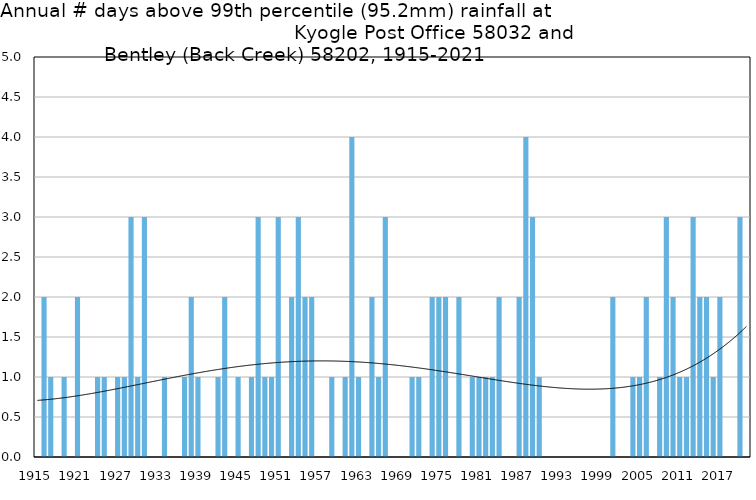
| Category | Annual # days above 99th percentile |
|---|---|
| 1915 | 0 |
| 1916 | 2 |
| 1917 | 1 |
| 1918 | 0 |
| 1919 | 1 |
| 1920 | 0 |
| 1921 | 2 |
| 1922 | 0 |
| 1923 | 0 |
| 1924 | 1 |
| 1925 | 1 |
| 1926 | 0 |
| 1927 | 1 |
| 1928 | 1 |
| 1929 | 3 |
| 1930 | 1 |
| 1931 | 3 |
| 1932 | 0 |
| 1933 | 0 |
| 1934 | 1 |
| 1935 | 0 |
| 1936 | 0 |
| 1937 | 1 |
| 1938 | 2 |
| 1939 | 1 |
| 1940 | 0 |
| 1941 | 0 |
| 1942 | 1 |
| 1943 | 2 |
| 1944 | 0 |
| 1945 | 1 |
| 1946 | 0 |
| 1947 | 1 |
| 1948 | 3 |
| 1949 | 1 |
| 1950 | 1 |
| 1951 | 3 |
| 1952 | 0 |
| 1953 | 2 |
| 1954 | 3 |
| 1955 | 2 |
| 1956 | 2 |
| 1957 | 0 |
| 1958 | 0 |
| 1959 | 1 |
| 1960 | 0 |
| 1961 | 1 |
| 1962 | 4 |
| 1963 | 1 |
| 1964 | 0 |
| 1965 | 2 |
| 1966 | 1 |
| 1967 | 3 |
| 1968 | 0 |
| 1969 | 0 |
| 1970 | 0 |
| 1971 | 1 |
| 1972 | 1 |
| 1973 | 0 |
| 1974 | 2 |
| 1975 | 2 |
| 1976 | 2 |
| 1977 | 0 |
| 1978 | 2 |
| 1979 | 0 |
| 1980 | 1 |
| 1981 | 1 |
| 1982 | 1 |
| 1983 | 1 |
| 1984 | 2 |
| 1985 | 0 |
| 1986 | 0 |
| 1987 | 2 |
| 1988 | 4 |
| 1989 | 3 |
| 1990 | 1 |
| 1991 | 0 |
| 1992 | 0 |
| 1993 | 0 |
| 1994 | 0 |
| 1995 | 0 |
| 1996 | 0 |
| 1997 | 0 |
| 1998 | 0 |
| 1999 | 0 |
| 2000 | 0 |
| 2001 | 2 |
| 2002 | 0 |
| 2003 | 0 |
| 2004 | 1 |
| 2005 | 1 |
| 2006 | 2 |
| 2007 | 0 |
| 2008 | 1 |
| 2009 | 3 |
| 2010 | 2 |
| 2011 | 1 |
| 2012 | 1 |
| 2013 | 3 |
| 2014 | 2 |
| 2015 | 2 |
| 2016 | 1 |
| 2017 | 2 |
| 2018 | 0 |
| 2019 | 0 |
| 2020 | 3 |
| 2021 | 0 |